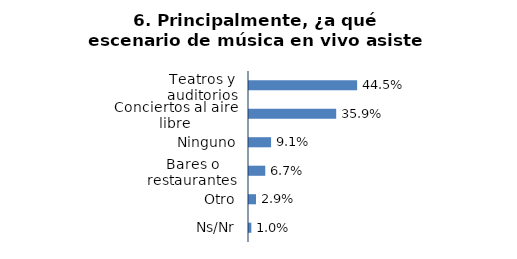
| Category | Series 0 |
|---|---|
| Teatros y auditorios | 0.445 |
| Conciertos al aire libre | 0.359 |
| Ninguno | 0.091 |
| Bares o restaurantes | 0.067 |
| Otro | 0.029 |
| Ns/Nr | 0.01 |